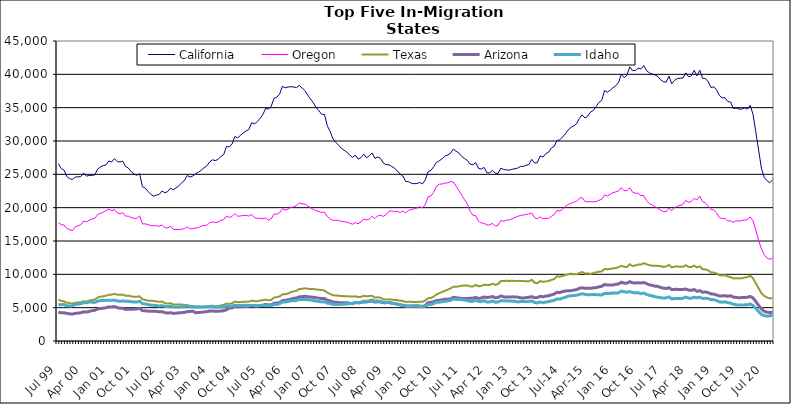
| Category | California | Oregon | Texas | Arizona | Idaho |
|---|---|---|---|---|---|
| Jul 99 | 26605 | 17749 | 6209 | 4339 | 5471 |
| Aug 99 | 25882 | 17447 | 6022 | 4228 | 5444 |
| Sep 99 | 25644 | 17401 | 5941 | 4237 | 5488 |
| Oct 99 | 24669 | 16875 | 5751 | 4134 | 5279 |
| Nov 99 | 24353 | 16701 | 5680 | 4073 | 5260 |
| Dec 99 | 24218 | 16570 | 5619 | 4042 | 5269 |
| Jan 00 | 24574 | 17109 | 5736 | 4142 | 5485 |
| Feb 00 | 24620 | 17295 | 5789 | 4192 | 5530 |
| Mar 00 | 24655 | 17436 | 5826 | 4226 | 5590 |
| Apr 00 | 25195 | 18009 | 5980 | 4375 | 5748 |
| May 00 | 24730 | 17875 | 5897 | 4337 | 5729 |
| Jun 00 | 24825 | 18113 | 6070 | 4444 | 5853 |
| Jul 00 | 24857 | 18294 | 6163 | 4555 | 5824 |
| Aug 00 | 24913 | 18376 | 6199 | 4603 | 5788 |
| Sep 00 | 25792 | 18971 | 6529 | 4804 | 5976 |
| Oct 00 | 26106 | 19135 | 6643 | 4870 | 6058 |
| Nov 00 | 26315 | 19306 | 6705 | 4926 | 6085 |
| Dec 00 | 26415 | 19570 | 6793 | 4991 | 6096 |
| Jan 01 | 26995 | 19781 | 6942 | 5122 | 6119 |
| Feb 01 | 26851 | 19519 | 6948 | 5089 | 6090 |
| Mar 01 | 27352 | 19720 | 7080 | 5180 | 6143 |
| Apr 01 | 26918 | 19221 | 6943 | 5020 | 6020 |
| May 01 | 26848 | 19126 | 6924 | 4899 | 5950 |
| Jun 01 | 26974 | 19241 | 6959 | 4895 | 6019 |
| Jul 01 | 26172 | 18725 | 6778 | 4737 | 5951 |
| Aug 01 | 25943 | 18736 | 6810 | 4757 | 5973 |
| Sep 01 | 25399 | 18514 | 6688 | 4753 | 5895 |
| Oct 01 | 25050 | 18415 | 6650 | 4780 | 5833 |
| Nov 01 | 24873 | 18381 | 6631 | 4826 | 5850 |
| Dec 01 | 25099 | 18765 | 6708 | 4898 | 5969 |
| Jan 02 | 23158 | 17561 | 6261 | 4560 | 5595 |
| Feb 02 | 22926 | 17573 | 6162 | 4531 | 5560 |
| Mar 02 | 22433 | 17452 | 6052 | 4481 | 5458 |
| Apr 02 | 22012 | 17314 | 6046 | 4458 | 5380 |
| May 02 | 21733 | 17267 | 6007 | 4452 | 5358 |
| Jun 02 | 21876 | 17298 | 5933 | 4444 | 5315 |
| Jul 02 | 21997 | 17209 | 5873 | 4383 | 5243 |
| Aug 02 | 22507 | 17436 | 5929 | 4407 | 5315 |
| Sep 02 | 22244 | 17010 | 5672 | 4248 | 5192 |
| Oct 02 | 22406 | 16952 | 5625 | 4191 | 5167 |
| Nov 02 | 22922 | 17223 | 5663 | 4242 | 5221 |
| Dec 02 | 22693 | 16770 | 5499 | 4142 | 5120 |
| Jan 03 | 22964 | 16694 | 5463 | 4166 | 5089 |
| Feb 03 | 23276 | 16727 | 5461 | 4226 | 5077 |
| Mar 03 | 23736 | 16766 | 5486 | 4251 | 5145 |
| Apr 03 | 24079 | 16859 | 5389 | 4289 | 5145 |
| May 03 | 24821 | 17117 | 5378 | 4415 | 5254 |
| Jun 03 | 24592 | 16812 | 5273 | 4426 | 5135 |
| Jul 03 | 24754 | 16875 | 5226 | 4466 | 5124 |
| Aug 03 | 25092 | 16922 | 5181 | 4244 | 5100 |
| Sep 03 | 25316 | 17036 | 5181 | 4279 | 5086 |
| Oct 03 | 25622 | 17228 | 5139 | 4301 | 5110 |
| Nov 03 | 25984 | 17335 | 5175 | 4362 | 5091 |
| Dec 03 | 26269 | 17350 | 5189 | 4396 | 5113 |
| Jan 04 | 26852 | 17734 | 5255 | 4492 | 5152 |
| Feb 04 | 27184 | 17860 | 5301 | 4502 | 5183 |
| Mar 04 | 27062 | 17757 | 5227 | 4443 | 5056 |
| Apr 04 | 27238 | 17840 | 5227 | 4461 | 5104 |
| May 04 | 27671 | 18113 | 5345 | 4493 | 5095 |
| Jun 04 | 27949 | 18201 | 5416 | 4532 | 5103 |
| Jul 04 | 29172 | 18727 | 5597 | 4697 | 5231 |
| Aug 04 | 29122 | 18529 | 5561 | 4945 | 5197 |
| Sep 04 | 29542 | 18678 | 5656 | 4976 | 5237 |
| Oct 04 | 30674 | 19108 | 5922 | 5188 | 5363 |
| Nov 04 | 30472 | 18716 | 5823 | 5106 | 5321 |
| Dec 04 | 30831 | 18755 | 5838 | 5135 | 5312 |
| Jan 05 | 31224 | 18823 | 5906 | 5155 | 5374 |
| Feb 05 | 31495 | 18842 | 5898 | 5168 | 5357 |
| Mar 05 | 31714 | 18738 | 5894 | 5212 | 5313 |
| Apr 05 | 32750 | 18998 | 6060 | 5340 | 5350 |
| May 05 | 32575 | 18504 | 5989 | 5269 | 5276 |
| Jun 05 | 32898 | 18414 | 5954 | 5252 | 5271 |
| Jul 05 | 33384 | 18395 | 6062 | 5322 | 5322 |
| Aug 05 | 33964 | 18381 | 6113 | 5375 | 5316 |
| Sep 05 | 34897 | 18426 | 6206 | 5493 | 5362 |
| Oct 05 | 34780 | 18132 | 6100 | 5408 | 5308 |
| Nov 05 | 35223 | 18332 | 6162 | 5434 | 5314 |
| Dec 05 | 36415 | 19047 | 6508 | 5658 | 5487 |
| Jan 06 | 36567 | 19032 | 6576 | 5688 | 5480 |
| Feb 06 | 37074 | 19257 | 6692 | 5792 | 5616 |
| Mar 06 | 38207 | 19845 | 6993 | 6052 | 5850 |
| Apr 06 | 37976 | 19637 | 7024 | 6101 | 5864 |
| May 06 | 38099 | 19781 | 7114 | 6178 | 5943 |
| Jun 06 | 38141 | 20061 | 7331 | 6276 | 6018 |
| Jul 06 | 38097 | 20111 | 7431 | 6399 | 6046 |
| Aug 06 | 38021 | 20333 | 7542 | 6450 | 6064 |
| Sep 06 | 38349 | 20686 | 7798 | 6627 | 6232 |
| Oct 06 | 37947 | 20591 | 7825 | 6647 | 6216 |
| Nov 06 | 37565 | 20526 | 7907 | 6707 | 6244 |
| Dec 06 | 36884 | 20272 | 7840 | 6648 | 6192 |
| Jan 07 | 36321 | 19984 | 7789 | 6597 | 6151 |
| Feb 07 | 35752 | 19752 | 7799 | 6554 | 6048 |
| Mar 07 | 35025 | 19547 | 7737 | 6487 | 5989 |
| Apr 07 | 34534 | 19412 | 7685 | 6430 | 5937 |
| May 07 | 34022 | 19296 | 7654 | 6353 | 5858 |
| Jun 07 | 33974 | 19318 | 7577 | 6390 | 5886 |
| Jul 07 | 32298 | 18677 | 7250 | 6117 | 5682 |
| Aug 07 | 31436 | 18322 | 7070 | 6034 | 5617 |
| Sep 07 | 30331 | 18087 | 6853 | 5847 | 5500 |
| Oct 07 | 29813 | 18108 | 6839 | 5821 | 5489 |
| Nov 07 | 29384 | 18105 | 6777 | 5769 | 5481 |
| Dec 07 | 28923 | 17949 | 6760 | 5733 | 5499 |
| Jan 08 | 28627 | 17890 | 6721 | 5732 | 5521 |
| Feb 08 | 28328 | 17834 | 6719 | 5749 | 5579 |
| Mar 08 | 27911 | 17680 | 6690 | 5650 | 5614 |
| Apr 08 | 27543 | 17512 | 6656 | 5612 | 5635 |
| May 08 | 27856 | 17754 | 6705 | 5774 | 5798 |
| Jun 08 | 27287 | 17589 | 6593 | 5717 | 5745 |
| Jul 08 | 27495 | 17834 | 6623 | 5761 | 5807 |
| Aug 08 | 28018 | 18309 | 6789 | 5867 | 5982 |
| Sep-08 | 27491 | 18164 | 6708 | 5864 | 5954 |
| Oct 08 | 27771 | 18291 | 6755 | 5942 | 6032 |
| Nov 08 | 28206 | 18706 | 6787 | 5970 | 6150 |
| Dec 08 | 27408 | 18353 | 6505 | 5832 | 5975 |
| Jan 09 | 27601 | 18778 | 6569 | 5890 | 5995 |
| Feb 09 | 27394 | 18863 | 6483 | 5845 | 5936 |
| Mar 09 | 26690 | 18694 | 6273 | 5751 | 5806 |
| Apr 09 | 26461 | 18943 | 6222 | 5735 | 5777 |
| May 09 | 26435 | 19470 | 6272 | 5819 | 5767 |
| Jun 09 | 26187 | 19522 | 6199 | 5700 | 5649 |
| Jul 09 | 25906 | 19408 | 6171 | 5603 | 5617 |
| Aug 09 | 25525 | 19469 | 6128 | 5533 | 5540 |
| Sep 09 | 25050 | 19249 | 6059 | 5405 | 5437 |
| Oct 09 | 24741 | 19529 | 6004 | 5349 | 5369 |
| Nov 09 | 23928 | 19187 | 5854 | 5271 | 5248 |
| Dec 09 | 23899 | 19607 | 5886 | 5261 | 5195 |
| Jan 10 | 23676 | 19703 | 5881 | 5232 | 5234 |
| Feb 10 | 23592 | 19845 | 5850 | 5272 | 5236 |
| Mar 10 | 23634 | 19946 | 5864 | 5278 | 5219 |
| Apr 10 | 23774 | 20134 | 5889 | 5257 | 5201 |
| May 10 | 23567 | 19966 | 5897 | 5172 | 5105 |
| Jun 10 | 24166 | 20464 | 6087 | 5356 | 5237 |
| Jul 10 | 25410 | 21627 | 6417 | 5742 | 5452 |
| Aug 10 | 25586 | 21744 | 6465 | 5797 | 5491 |
| Sep 10 | 26150 | 22314 | 6667 | 5907 | 5609 |
| Oct 10 | 26807 | 23219 | 6986 | 6070 | 5831 |
| Nov 10 | 27033 | 23520 | 7179 | 6100 | 5810 |
| Dec 10 | 27332 | 23551 | 7361 | 6182 | 5898 |
| Jan 11 | 27769 | 23697 | 7525 | 6276 | 5938 |
| Feb 11 | 27898 | 23718 | 7708 | 6267 | 6016 |
| Mar 11 | 28155 | 23921 | 7890 | 6330 | 6081 |
| Apr 11 | 28790 | 23847 | 8146 | 6544 | 6305 |
| May 11 | 28471 | 23215 | 8131 | 6502 | 6248 |
| Jun 11 | 28191 | 22580 | 8199 | 6445 | 6217 |
| Jul 11 | 27678 | 21867 | 8291 | 6368 | 6202 |
| Aug 11 | 27372 | 21203 | 8321 | 6356 | 6146 |
| Sep 11 | 27082 | 20570 | 8341 | 6387 | 6075 |
| Oct 11 | 26528 | 19442 | 8191 | 6402 | 5932 |
| Nov 11 | 26440 | 18872 | 8176 | 6426 | 5968 |
| Dec 11 | 26770 | 18784 | 8401 | 6533 | 6106 |
| Jan 12 | 25901 | 17963 | 8202 | 6390 | 5933 |
| Feb 12 | 25796 | 17718 | 8266 | 6456 | 5900 |
| Mar 12 | 26042 | 17647 | 8456 | 6600 | 6054 |
| Apr 12 | 25239 | 17386 | 8388 | 6534 | 5838 |
| May 12 | 25238 | 17407 | 8401 | 6558 | 5854 |
| Jun 12 | 25593 | 17673 | 8594 | 6669 | 6009 |
| Jul 12 | 25155 | 17237 | 8432 | 6474 | 5817 |
| Aug 12 | 25146 | 17391 | 8536 | 6539 | 5842 |
| Sep 12 | 25942 | 18102 | 8989 | 6759 | 6061 |
| Oct 12 | 25718 | 17953 | 9012 | 6618 | 6027 |
| Nov 12 | 25677 | 18134 | 9032 | 6611 | 6009 |
| Dec 12 | 25619 | 18166 | 8981 | 6601 | 5999 |
| Jan 13 | 25757 | 18344 | 9051 | 6627 | 5989 |
| Feb-13 | 25830 | 18512 | 9001 | 6606 | 5968 |
| Mar-13 | 25940 | 18689 | 9021 | 6577 | 5853 |
| Apr 13 | 26187 | 18844 | 9013 | 6478 | 5925 |
| May 13 | 26192 | 18884 | 9003 | 6431 | 5924 |
| Jun-13 | 26362 | 19013 | 8948 | 6508 | 5896 |
| Jul 13 | 26467 | 19037 | 8958 | 6559 | 5948 |
| Aug 13 | 27253 | 19198 | 9174 | 6655 | 6020 |
| Sep 13 | 26711 | 18501 | 8747 | 6489 | 5775 |
| Oct 13 | 26733 | 18301 | 8681 | 6511 | 5711 |
| Nov 13 | 27767 | 18620 | 8989 | 6709 | 5860 |
| Dec 13 | 27583 | 18320 | 8863 | 6637 | 5740 |
| Jan 14 | 28107 | 18409 | 8939 | 6735 | 5843 |
| Feb-14 | 28313 | 18383 | 8989 | 6779 | 5893 |
| Mar 14 | 28934 | 18696 | 9160 | 6918 | 6015 |
| Apr 14 | 29192 | 18946 | 9291 | 7036 | 6099 |
| May 14 | 30069 | 19603 | 9701 | 7314 | 6304 |
| Jun 14 | 30163 | 19487 | 9641 | 7252 | 6293 |
| Jul-14 | 30587 | 19754 | 9752 | 7415 | 6427 |
| Aug-14 | 31074 | 20201 | 9882 | 7499 | 6557 |
| Sep 14 | 31656 | 20459 | 9997 | 7536 | 6719 |
| Oct 14 | 32037 | 20663 | 10109 | 7555 | 6786 |
| Nov 14 | 32278 | 20825 | 9992 | 7628 | 6831 |
| Dec 14 | 32578 | 20918 | 10006 | 7705 | 6860 |
| Jan 15 | 33414 | 21396 | 10213 | 7906 | 7000 |
| Feb 15 | 33922 | 21518 | 10337 | 7982 | 7083 |
| Mar 15 | 33447 | 20942 | 10122 | 7891 | 7006 |
| Apr-15 | 33731 | 20893 | 10138 | 7906 | 6931 |
| May 15 | 34343 | 20902 | 10053 | 7895 | 6952 |
| Jun-15 | 34572 | 20870 | 10192 | 7973 | 6966 |
| Jul 15 | 35185 | 20916 | 10303 | 8000 | 6949 |
| Aug 15 | 35780 | 21115 | 10399 | 8126 | 6938 |
| Sep 15 | 36109 | 21246 | 10428 | 8207 | 6896 |
| Oct 15 | 37555 | 21908 | 10813 | 8477 | 7140 |
| Nov 15 | 37319 | 21750 | 10763 | 8390 | 7112 |
| Dec 15 | 37624 | 21990 | 10807 | 8395 | 7149 |
| Jan 16 | 37978 | 22248 | 10892 | 8388 | 7201 |
| Feb 16 | 38285 | 22369 | 10951 | 8508 | 7192 |
| Mar 16 | 38792 | 22506 | 11075 | 8547 | 7226 |
| Apr 16 | 39994 | 22999 | 11286 | 8815 | 7487 |
| May 16 | 39488 | 22548 | 11132 | 8673 | 7382 |
| Jun 16 | 39864 | 22556 | 11100 | 8682 | 7315 |
| Jul 16 | 41123 | 22989 | 11516 | 8903 | 7420 |
| Aug 16 | 40573 | 22333 | 11251 | 8731 | 7261 |
| Sep 16 | 40560 | 22162 | 11340 | 8692 | 7216 |
| Oct 16 | 40923 | 22172 | 11456 | 8742 | 7233 |
| Nov 16 | 40817 | 21818 | 11459 | 8685 | 7101 |
| Dec 16 | 41311 | 21815 | 11681 | 8783 | 7203 |
| Jan 17 | 40543 | 21029 | 11524 | 8609 | 6982 |
| Feb 17 | 40218 | 20613 | 11385 | 8416 | 6852 |
| Mar 17 | 40052 | 20425 | 11276 | 8354 | 6775 |
| Apr 17 | 39913 | 20147 | 11297 | 8218 | 6653 |
| May 17 | 39695 | 19910 | 11265 | 8196 | 6552 |
| Jun 17 | 39177 | 19650 | 11225 | 8034 | 6500 |
| Jul 17 | 38901 | 19419 | 11115 | 7923 | 6429 |
| Aug 17 | 38827 | 19389 | 11168 | 7867 | 6479 |
| Sep 17 | 39736 | 19936 | 11426 | 7991 | 6609 |
| Oct 17 | 38576 | 19547 | 11041 | 7708 | 6315 |
| Nov 17 | 39108 | 20013 | 11158 | 7746 | 6381 |
| Dec 17 | 39359 | 20202 | 11185 | 7743 | 6366 |
| Jan 18 | 39420 | 20362 | 11118 | 7736 | 6380 |
| Feb 18 | 39440 | 20476 | 11128 | 7741 | 6407 |
| Mar 18 | 40218 | 21106 | 11362 | 7789 | 6578 |
| Apr 18 | 39637 | 20788 | 11111 | 7642 | 6423 |
| May 18 | 39777 | 20933 | 11097 | 7591 | 6430 |
| Jun 18 | 40602 | 21381 | 11317 | 7721 | 6554 |
| Jul 18 | 39767 | 21189 | 11038 | 7445 | 6489 |
| Aug 18 | 40608 | 21729 | 11200 | 7560 | 6569 |
| Sep 18 | 39395 | 20916 | 10772 | 7318 | 6383 |
| Oct 18 | 39383 | 20724 | 10740 | 7344 | 6429 |
| Nov 18 | 38891 | 20265 | 10605 | 7255 | 6365 |
| Dec 18 | 38013 | 19741 | 10292 | 7069 | 6205 |
| Jan 19 | 38130 | 19643 | 10261 | 7032 | 6203 |
| Feb 19 | 37658 | 19237 | 10132 | 6892 | 6073 |
| Mar 19 | 36831 | 18492 | 9848 | 6766 | 5863 |
| Apr 19 | 36492 | 18349 | 9839 | 6763 | 5827 |
| May 19 | 36481 | 18407 | 9867 | 6809 | 5873 |
| Jun 19 | 35925 | 17998 | 9661 | 6698 | 5761 |
| Jul 19 | 35843 | 18049 | 9598 | 6800 | 5673 |
| Aug 19 | 34870 | 17785 | 9361 | 6577 | 5512 |
| Sep 19 | 34945 | 18038 | 9428 | 6547 | 5437 |
| Oct 19 | 34802 | 17977 | 9385 | 6483 | 5390 |
| Nov 19 | 34775 | 18072 | 9403 | 6511 | 5401 |
| Dec 19 | 34976 | 18140 | 9518 | 6521 | 5419 |
| Jan 20 | 34774 | 18209 | 9594 | 6561 | 5434 |
| Feb 20 | 35352 | 18632 | 9804 | 6682 | 5543 |
| Mar 20 | 34013 | 18041 | 9411 | 6464 | 5330 |
| Apr 20 | 31385 | 16629 | 8666 | 5922 | 4906 |
| May 20 | 28657 | 15123 | 7927 | 5355 | 4419 |
| Jun 20 | 25915 | 13817 | 7164 | 4815 | 3992 |
| Jul 20 | 24545 | 12926 | 6776 | 4457 | 3810 |
| Aug 20 | 24048 | 12443 | 6521 | 4326 | 3720 |
| Sep 20 | 23756 | 12258 | 6386 | 4266 | 3784 |
| Oct 20 | 24166 | 12429 | 6452 | 4347 | 3861 |